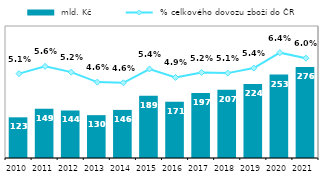
| Category |  mld. Kč |
|---|---|
| 2010 | 123.278 |
| 2011 | 149.274 |
| 2012 | 143.98 |
| 2013 | 129.839 |
| 2014 | 145.75 |
| 2015 | 189.009 |
| 2016 | 170.63 |
| 2017 | 196.963 |
| 2018 | 206.974 |
| 2019 | 224.436 |
| 2020 | 253.026 |
| 2021 | 275.788 |